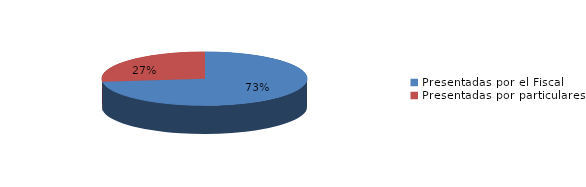
| Category | Series 0 |
|---|---|
| Presentadas por el Fiscal | 269 |
| Presentadas por particulares | 99 |